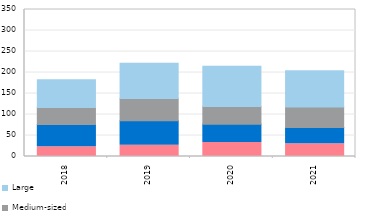
| Category | Micro | Small | Medium-sized | Large |
|---|---|---|---|---|
| 2018-01-01 | 23.458 | 52.774 | 40.183 | 66.517 |
| nan | 25.544 | 54.802 | 52.603 | 77.229 |
| nan | 28.673 | 54.873 | 42.484 | 103.899 |
| nan | 37.41 | 70.984 | 51.038 | 152.215 |
| 2019-01-01 | 26.913 | 58.293 | 53.033 | 83.702 |
| nan | 35.763 | 61.475 | 78.723 | 111.897 |
| nan | 27.759 | 70.634 | 86.103 | 106.825 |
| nan | 44.489 | 62.561 | 59.132 | 108.665 |
| 2020-01-01 | 33.497 | 43.549 | 42.255 | 95.672 |
| nan | 32.961 | 54.332 | 59.003 | 72.028 |
| nan | 25.293 | 59.78 | 76.792 | 86.501 |
| nan | 37.626 | 49.063 | 68.305 | 103.2 |
| 2021-01-01 | 30.617 | 38.71 | 48.392 | 86.375 |